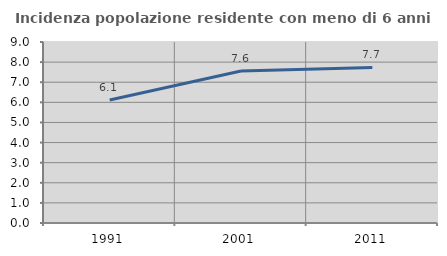
| Category | Incidenza popolazione residente con meno di 6 anni |
|---|---|
| 1991.0 | 6.12 |
| 2001.0 | 7.555 |
| 2011.0 | 7.733 |